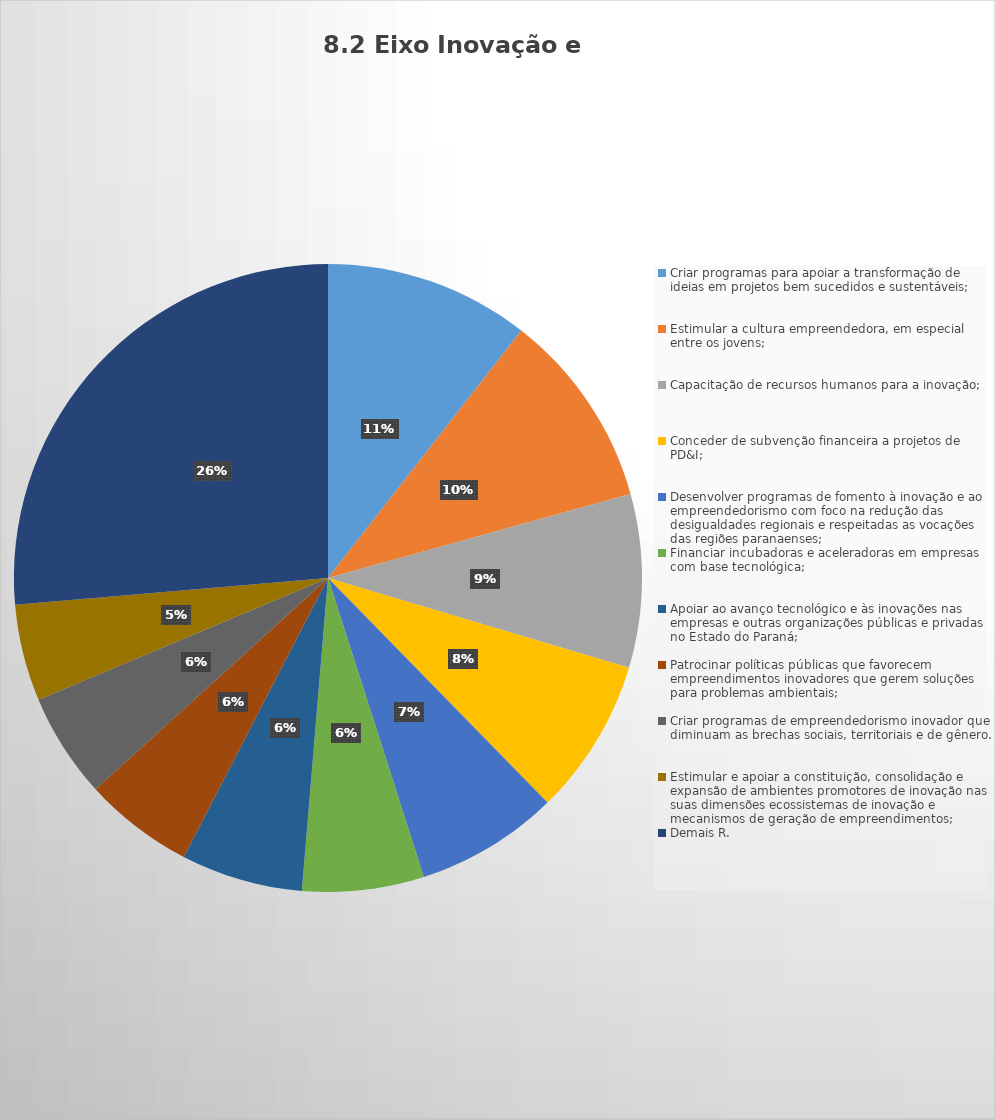
| Category | Series 0 |
|---|---|
| Criar programas para apoiar a transformação de ideias em projetos bem sucedidos e sustentáveis; | 123 |
| Estimular a cultura empreendedora, em especial entre os jovens; | 118 |
| Capacitação de recursos humanos para a inovação; | 104 |
| Conceder de subvenção financeira a projetos de PD&I; | 94 |
| Desenvolver programas de fomento à inovação e ao empreendedorismo com foco na redução das desigualdades regionais e respeitadas as vocações das regiões paranaenses; | 86 |
| Financiar incubadoras e aceleradoras em empresas com base tecnológica; | 73 |
| Apoiar ao avanço tecnológico e às inovações nas empresas e outras organizações públicas e privadas no Estado do Paraná; | 73 |
| Patrocinar políticas públicas que favorecem empreendimentos inovadores que gerem soluções para problemas ambientais; | 66 |
| Criar programas de empreendedorismo inovador que diminuam as brechas sociais, territoriais e de gênero. | 63 |
| Estimular e apoiar a constituição, consolidação e expansão de ambientes promotores de inovação nas suas dimensões ecossistemas de inovação e mecanismos de geração de empreendimentos; | 58 |
| Demais R. | 307 |